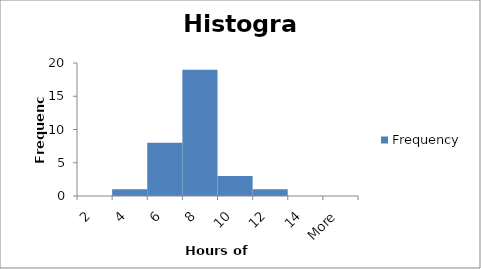
| Category | Frequency |
|---|---|
| 2 | 0 |
| 4 | 1 |
| 6 | 8 |
| 8 | 19 |
| 10 | 3 |
| 12 | 1 |
| 14 | 0 |
| More | 0 |